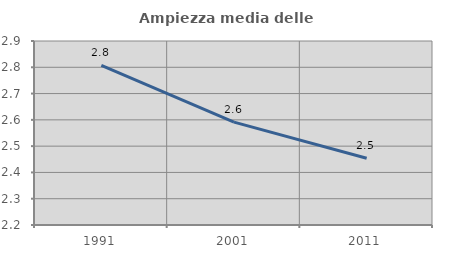
| Category | Ampiezza media delle famiglie |
|---|---|
| 1991.0 | 2.807 |
| 2001.0 | 2.591 |
| 2011.0 | 2.454 |